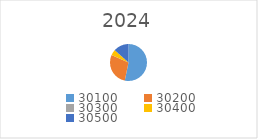
| Category | Series 0 |
|---|---|
| 30100.0 | 1283509 |
| 30200.0 | 682800 |
| 30300.0 | 1600 |
| 30400.0 | 120000 |
| 30500.0 | 322387 |